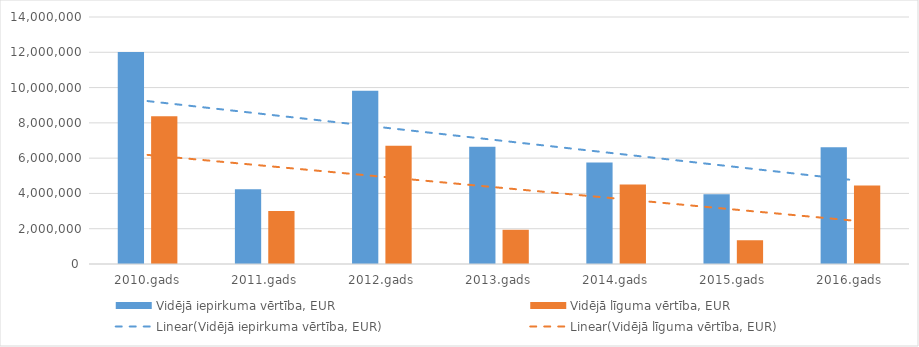
| Category | Vidējā iepirkuma vērtība, EUR | Vidējā līguma vērtība, EUR |
|---|---|---|
| 2010.gads | 12014192 | 8376192 |
| 2011.gads | 4236994 | 3003839 |
| 2012.gads | 9814321 | 6697611 |
| 2013.gads | 6642750 | 1940382 |
| 2014.gads | 5749010 | 4500869 |
| 2015.gads | 3952429 | 1346432 |
| 2016.gads | 6618635 | 4442645 |